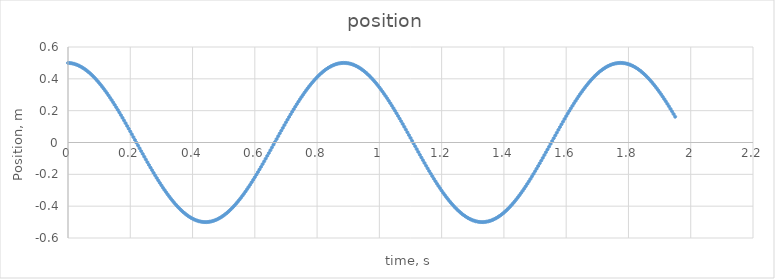
| Category | position |
|---|---|
| 0.0 | 0.5 |
| 0.005 | 0.499 |
| 0.01 | 0.498 |
| 0.015 | 0.496 |
| 0.02 | 0.494 |
| 0.025 | 0.491 |
| 0.030000000000000002 | 0.487 |
| 0.035 | 0.483 |
| 0.04 | 0.478 |
| 0.045 | 0.472 |
| 0.049999999999999996 | 0.466 |
| 0.05499999999999999 | 0.459 |
| 0.05999999999999999 | 0.452 |
| 0.06499999999999999 | 0.444 |
| 0.06999999999999999 | 0.436 |
| 0.075 | 0.427 |
| 0.08 | 0.417 |
| 0.085 | 0.407 |
| 0.09000000000000001 | 0.397 |
| 0.09500000000000001 | 0.386 |
| 0.10000000000000002 | 0.374 |
| 0.10500000000000002 | 0.362 |
| 0.11000000000000003 | 0.35 |
| 0.11500000000000003 | 0.337 |
| 0.12000000000000004 | 0.324 |
| 0.12500000000000003 | 0.31 |
| 0.13000000000000003 | 0.296 |
| 0.13500000000000004 | 0.282 |
| 0.14000000000000004 | 0.267 |
| 0.14500000000000005 | 0.252 |
| 0.15000000000000005 | 0.236 |
| 0.15500000000000005 | 0.221 |
| 0.16000000000000006 | 0.205 |
| 0.16500000000000006 | 0.188 |
| 0.17000000000000007 | 0.172 |
| 0.17500000000000007 | 0.155 |
| 0.18000000000000008 | 0.138 |
| 0.18500000000000008 | 0.121 |
| 0.19000000000000009 | 0.104 |
| 0.1950000000000001 | 0.087 |
| 0.2000000000000001 | 0.069 |
| 0.2050000000000001 | 0.052 |
| 0.2100000000000001 | 0.034 |
| 0.2150000000000001 | 0.016 |
| 0.2200000000000001 | -0.001 |
| 0.22500000000000012 | -0.019 |
| 0.23000000000000012 | -0.037 |
| 0.23500000000000013 | -0.054 |
| 0.24000000000000013 | -0.072 |
| 0.24500000000000013 | -0.089 |
| 0.2500000000000001 | -0.107 |
| 0.2550000000000001 | -0.124 |
| 0.2600000000000001 | -0.141 |
| 0.2650000000000001 | -0.158 |
| 0.27000000000000013 | -0.174 |
| 0.27500000000000013 | -0.191 |
| 0.28000000000000014 | -0.207 |
| 0.28500000000000014 | -0.223 |
| 0.29000000000000015 | -0.239 |
| 0.29500000000000015 | -0.254 |
| 0.30000000000000016 | -0.269 |
| 0.30500000000000016 | -0.284 |
| 0.31000000000000016 | -0.298 |
| 0.31500000000000017 | -0.312 |
| 0.3200000000000002 | -0.326 |
| 0.3250000000000002 | -0.339 |
| 0.3300000000000002 | -0.352 |
| 0.3350000000000002 | -0.364 |
| 0.3400000000000002 | -0.376 |
| 0.3450000000000002 | -0.388 |
| 0.3500000000000002 | -0.398 |
| 0.3550000000000002 | -0.409 |
| 0.3600000000000002 | -0.419 |
| 0.3650000000000002 | -0.428 |
| 0.3700000000000002 | -0.437 |
| 0.3750000000000002 | -0.445 |
| 0.3800000000000002 | -0.453 |
| 0.38500000000000023 | -0.46 |
| 0.39000000000000024 | -0.467 |
| 0.39500000000000024 | -0.473 |
| 0.40000000000000024 | -0.478 |
| 0.40500000000000025 | -0.483 |
| 0.41000000000000025 | -0.488 |
| 0.41500000000000026 | -0.491 |
| 0.42000000000000026 | -0.494 |
| 0.42500000000000027 | -0.497 |
| 0.43000000000000027 | -0.498 |
| 0.4350000000000003 | -0.5 |
| 0.4400000000000003 | -0.5 |
| 0.4450000000000003 | -0.5 |
| 0.4500000000000003 | -0.499 |
| 0.4550000000000003 | -0.498 |
| 0.4600000000000003 | -0.496 |
| 0.4650000000000003 | -0.493 |
| 0.4700000000000003 | -0.49 |
| 0.4750000000000003 | -0.486 |
| 0.4800000000000003 | -0.482 |
| 0.4850000000000003 | -0.477 |
| 0.4900000000000003 | -0.471 |
| 0.49500000000000033 | -0.465 |
| 0.5000000000000003 | -0.458 |
| 0.5050000000000003 | -0.451 |
| 0.5100000000000003 | -0.443 |
| 0.5150000000000003 | -0.435 |
| 0.5200000000000004 | -0.425 |
| 0.5250000000000004 | -0.416 |
| 0.5300000000000004 | -0.406 |
| 0.5350000000000004 | -0.395 |
| 0.5400000000000004 | -0.384 |
| 0.5450000000000004 | -0.373 |
| 0.5500000000000004 | -0.361 |
| 0.5550000000000004 | -0.348 |
| 0.5600000000000004 | -0.335 |
| 0.5650000000000004 | -0.322 |
| 0.5700000000000004 | -0.308 |
| 0.5750000000000004 | -0.294 |
| 0.5800000000000004 | -0.28 |
| 0.5850000000000004 | -0.265 |
| 0.5900000000000004 | -0.25 |
| 0.5950000000000004 | -0.234 |
| 0.6000000000000004 | -0.218 |
| 0.6050000000000004 | -0.202 |
| 0.6100000000000004 | -0.186 |
| 0.6150000000000004 | -0.169 |
| 0.6200000000000004 | -0.153 |
| 0.6250000000000004 | -0.136 |
| 0.6300000000000004 | -0.119 |
| 0.6350000000000005 | -0.101 |
| 0.6400000000000005 | -0.084 |
| 0.6450000000000005 | -0.067 |
| 0.6500000000000005 | -0.049 |
| 0.6550000000000005 | -0.031 |
| 0.6600000000000005 | -0.014 |
| 0.6650000000000005 | 0.004 |
| 0.6700000000000005 | 0.022 |
| 0.6750000000000005 | 0.039 |
| 0.6800000000000005 | 0.057 |
| 0.6850000000000005 | 0.074 |
| 0.6900000000000005 | 0.092 |
| 0.6950000000000005 | 0.109 |
| 0.7000000000000005 | 0.126 |
| 0.7050000000000005 | 0.143 |
| 0.7100000000000005 | 0.16 |
| 0.7150000000000005 | 0.177 |
| 0.7200000000000005 | 0.193 |
| 0.7250000000000005 | 0.209 |
| 0.7300000000000005 | 0.225 |
| 0.7350000000000005 | 0.241 |
| 0.7400000000000005 | 0.256 |
| 0.7450000000000006 | 0.271 |
| 0.7500000000000006 | 0.286 |
| 0.7550000000000006 | 0.3 |
| 0.7600000000000006 | 0.314 |
| 0.7650000000000006 | 0.328 |
| 0.7700000000000006 | 0.341 |
| 0.7750000000000006 | 0.354 |
| 0.7800000000000006 | 0.366 |
| 0.7850000000000006 | 0.378 |
| 0.7900000000000006 | 0.389 |
| 0.7950000000000006 | 0.4 |
| 0.8000000000000006 | 0.41 |
| 0.8050000000000006 | 0.42 |
| 0.8100000000000006 | 0.43 |
| 0.8150000000000006 | 0.438 |
| 0.8200000000000006 | 0.447 |
| 0.8250000000000006 | 0.454 |
| 0.8300000000000006 | 0.461 |
| 0.8350000000000006 | 0.468 |
| 0.8400000000000006 | 0.474 |
| 0.8450000000000006 | 0.479 |
| 0.8500000000000006 | 0.484 |
| 0.8550000000000006 | 0.488 |
| 0.8600000000000007 | 0.492 |
| 0.8650000000000007 | 0.495 |
| 0.8700000000000007 | 0.497 |
| 0.8750000000000007 | 0.499 |
| 0.8800000000000007 | 0.5 |
| 0.8850000000000007 | 0.5 |
| 0.8900000000000007 | 0.5 |
| 0.8950000000000007 | 0.499 |
| 0.9000000000000007 | 0.498 |
| 0.9050000000000007 | 0.496 |
| 0.9100000000000007 | 0.493 |
| 0.9150000000000007 | 0.49 |
| 0.9200000000000007 | 0.486 |
| 0.9250000000000007 | 0.481 |
| 0.9300000000000007 | 0.476 |
| 0.9350000000000007 | 0.47 |
| 0.9400000000000007 | 0.464 |
| 0.9450000000000007 | 0.457 |
| 0.9500000000000007 | 0.45 |
| 0.9550000000000007 | 0.442 |
| 0.9600000000000007 | 0.433 |
| 0.9650000000000007 | 0.424 |
| 0.9700000000000008 | 0.414 |
| 0.9750000000000008 | 0.404 |
| 0.9800000000000008 | 0.394 |
| 0.9850000000000008 | 0.383 |
| 0.9900000000000008 | 0.371 |
| 0.9950000000000008 | 0.359 |
| 1.0000000000000007 | 0.346 |
| 1.0050000000000006 | 0.333 |
| 1.0100000000000005 | 0.32 |
| 1.0150000000000003 | 0.306 |
| 1.0200000000000002 | 0.292 |
| 1.0250000000000001 | 0.277 |
| 1.03 | 0.263 |
| 1.035 | 0.247 |
| 1.0399999999999998 | 0.232 |
| 1.0449999999999997 | 0.216 |
| 1.0499999999999996 | 0.2 |
| 1.0549999999999995 | 0.184 |
| 1.0599999999999994 | 0.167 |
| 1.0649999999999993 | 0.15 |
| 1.0699999999999992 | 0.133 |
| 1.074999999999999 | 0.116 |
| 1.079999999999999 | 0.099 |
| 1.0849999999999989 | 0.082 |
| 1.0899999999999987 | 0.064 |
| 1.0949999999999986 | 0.046 |
| 1.0999999999999985 | 0.029 |
| 1.1049999999999984 | 0.011 |
| 1.1099999999999983 | -0.006 |
| 1.1149999999999982 | -0.024 |
| 1.119999999999998 | -0.042 |
| 1.124999999999998 | -0.059 |
| 1.129999999999998 | -0.077 |
| 1.1349999999999978 | -0.094 |
| 1.1399999999999977 | -0.112 |
| 1.1449999999999976 | -0.129 |
| 1.1499999999999975 | -0.146 |
| 1.1549999999999974 | -0.163 |
| 1.1599999999999973 | -0.179 |
| 1.1649999999999971 | -0.196 |
| 1.169999999999997 | -0.212 |
| 1.174999999999997 | -0.228 |
| 1.1799999999999968 | -0.243 |
| 1.1849999999999967 | -0.259 |
| 1.1899999999999966 | -0.274 |
| 1.1949999999999965 | -0.288 |
| 1.1999999999999964 | -0.302 |
| 1.2049999999999963 | -0.316 |
| 1.2099999999999962 | -0.33 |
| 1.214999999999996 | -0.343 |
| 1.219999999999996 | -0.356 |
| 1.2249999999999959 | -0.368 |
| 1.2299999999999958 | -0.379 |
| 1.2349999999999957 | -0.391 |
| 1.2399999999999956 | -0.402 |
| 1.2449999999999954 | -0.412 |
| 1.2499999999999953 | -0.422 |
| 1.2549999999999952 | -0.431 |
| 1.2599999999999951 | -0.44 |
| 1.264999999999995 | -0.448 |
| 1.269999999999995 | -0.455 |
| 1.2749999999999948 | -0.462 |
| 1.2799999999999947 | -0.469 |
| 1.2849999999999946 | -0.475 |
| 1.2899999999999945 | -0.48 |
| 1.2949999999999944 | -0.485 |
| 1.2999999999999943 | -0.489 |
| 1.3049999999999942 | -0.492 |
| 1.309999999999994 | -0.495 |
| 1.314999999999994 | -0.497 |
| 1.3199999999999938 | -0.499 |
| 1.3249999999999937 | -0.5 |
| 1.3299999999999936 | -0.5 |
| 1.3349999999999935 | -0.5 |
| 1.3399999999999934 | -0.499 |
| 1.3449999999999933 | -0.497 |
| 1.3499999999999932 | -0.495 |
| 1.354999999999993 | -0.492 |
| 1.359999999999993 | -0.489 |
| 1.3649999999999929 | -0.485 |
| 1.3699999999999928 | -0.48 |
| 1.3749999999999927 | -0.475 |
| 1.3799999999999926 | -0.47 |
| 1.3849999999999925 | -0.463 |
| 1.3899999999999924 | -0.456 |
| 1.3949999999999922 | -0.449 |
| 1.3999999999999921 | -0.441 |
| 1.404999999999992 | -0.432 |
| 1.409999999999992 | -0.423 |
| 1.4149999999999918 | -0.413 |
| 1.4199999999999917 | -0.403 |
| 1.4249999999999916 | -0.392 |
| 1.4299999999999915 | -0.381 |
| 1.4349999999999914 | -0.369 |
| 1.4399999999999913 | -0.357 |
| 1.4449999999999912 | -0.344 |
| 1.449999999999991 | -0.331 |
| 1.454999999999991 | -0.318 |
| 1.4599999999999909 | -0.304 |
| 1.4649999999999908 | -0.29 |
| 1.4699999999999906 | -0.275 |
| 1.4749999999999905 | -0.26 |
| 1.4799999999999904 | -0.245 |
| 1.4849999999999903 | -0.23 |
| 1.4899999999999902 | -0.214 |
| 1.4949999999999901 | -0.198 |
| 1.49999999999999 | -0.181 |
| 1.50499999999999 | -0.165 |
| 1.5099999999999898 | -0.148 |
| 1.5149999999999897 | -0.131 |
| 1.5199999999999896 | -0.114 |
| 1.5249999999999895 | -0.096 |
| 1.5299999999999894 | -0.079 |
| 1.5349999999999893 | -0.061 |
| 1.5399999999999892 | -0.044 |
| 1.544999999999989 | -0.026 |
| 1.549999999999989 | -0.009 |
| 1.5549999999999888 | 0.009 |
| 1.5599999999999887 | 0.027 |
| 1.5649999999999886 | 0.044 |
| 1.5699999999999885 | 0.062 |
| 1.5749999999999884 | 0.079 |
| 1.5799999999999883 | 0.097 |
| 1.5849999999999882 | 0.114 |
| 1.589999999999988 | 0.131 |
| 1.594999999999988 | 0.148 |
| 1.5999999999999879 | 0.165 |
| 1.6049999999999878 | 0.182 |
| 1.6099999999999877 | 0.198 |
| 1.6149999999999876 | 0.214 |
| 1.6199999999999875 | 0.23 |
| 1.6249999999999873 | 0.246 |
| 1.6299999999999872 | 0.261 |
| 1.6349999999999871 | 0.276 |
| 1.639999999999987 | 0.29 |
| 1.644999999999987 | 0.304 |
| 1.6499999999999868 | 0.318 |
| 1.6549999999999867 | 0.332 |
| 1.6599999999999866 | 0.345 |
| 1.6649999999999865 | 0.357 |
| 1.6699999999999864 | 0.369 |
| 1.6749999999999863 | 0.381 |
| 1.6799999999999862 | 0.392 |
| 1.684999999999986 | 0.403 |
| 1.689999999999986 | 0.413 |
| 1.6949999999999859 | 0.423 |
| 1.6999999999999857 | 0.432 |
| 1.7049999999999856 | 0.441 |
| 1.7099999999999855 | 0.449 |
| 1.7149999999999854 | 0.456 |
| 1.7199999999999853 | 0.463 |
| 1.7249999999999852 | 0.47 |
| 1.729999999999985 | 0.475 |
| 1.734999999999985 | 0.481 |
| 1.739999999999985 | 0.485 |
| 1.7449999999999848 | 0.489 |
| 1.7499999999999847 | 0.493 |
| 1.7549999999999846 | 0.495 |
| 1.7599999999999845 | 0.497 |
| 1.7649999999999844 | 0.499 |
| 1.7699999999999843 | 0.5 |
| 1.7749999999999841 | 0.5 |
| 1.779999999999984 | 0.5 |
| 1.784999999999984 | 0.499 |
| 1.7899999999999838 | 0.497 |
| 1.7949999999999837 | 0.495 |
| 1.7999999999999836 | 0.492 |
| 1.8049999999999835 | 0.489 |
| 1.8099999999999834 | 0.484 |
| 1.8149999999999833 | 0.48 |
| 1.8199999999999832 | 0.474 |
| 1.824999999999983 | 0.469 |
| 1.829999999999983 | 0.462 |
| 1.8349999999999829 | 0.455 |
| 1.8399999999999828 | 0.447 |
| 1.8449999999999827 | 0.439 |
| 1.8499999999999825 | 0.431 |
| 1.8549999999999824 | 0.421 |
| 1.8599999999999823 | 0.412 |
| 1.8649999999999822 | 0.401 |
| 1.8699999999999821 | 0.39 |
| 1.874999999999982 | 0.379 |
| 1.879999999999982 | 0.367 |
| 1.8849999999999818 | 0.355 |
| 1.8899999999999817 | 0.343 |
| 1.8949999999999816 | 0.329 |
| 1.8999999999999815 | 0.316 |
| 1.9049999999999814 | 0.302 |
| 1.9099999999999813 | 0.288 |
| 1.9149999999999812 | 0.273 |
| 1.919999999999981 | 0.258 |
| 1.924999999999981 | 0.243 |
| 1.9299999999999808 | 0.227 |
| 1.9349999999999807 | 0.211 |
| 1.9399999999999806 | 0.195 |
| 1.9449999999999805 | 0.179 |
| 1.9499999999999804 | 0.162 |